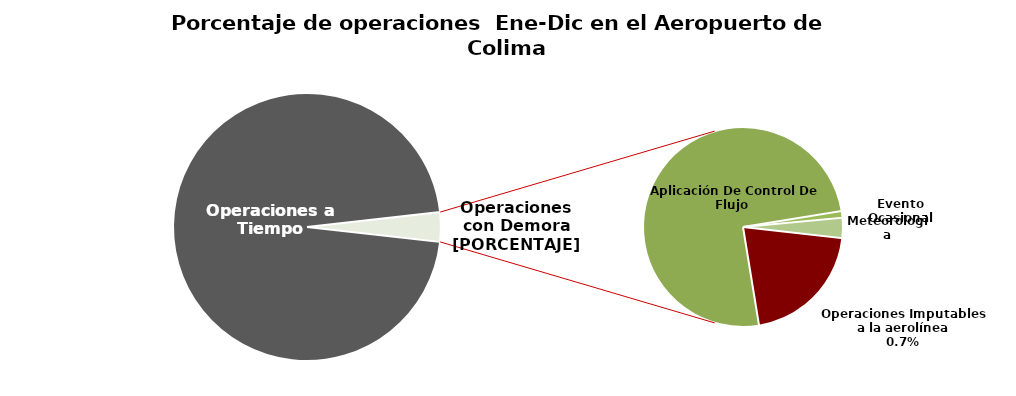
| Category | Series 0 |
|---|---|
| Operaciones a Tiempo | 2497 |
| Operaciones Imputables a la aerolínea | 19 |
| Aplicación De Control De Flujo  | 69 |
| Evento Ocasional | 1 |
| Meteorologia | 3 |